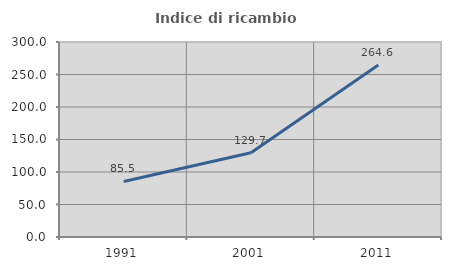
| Category | Indice di ricambio occupazionale  |
|---|---|
| 1991.0 | 85.495 |
| 2001.0 | 129.657 |
| 2011.0 | 264.621 |